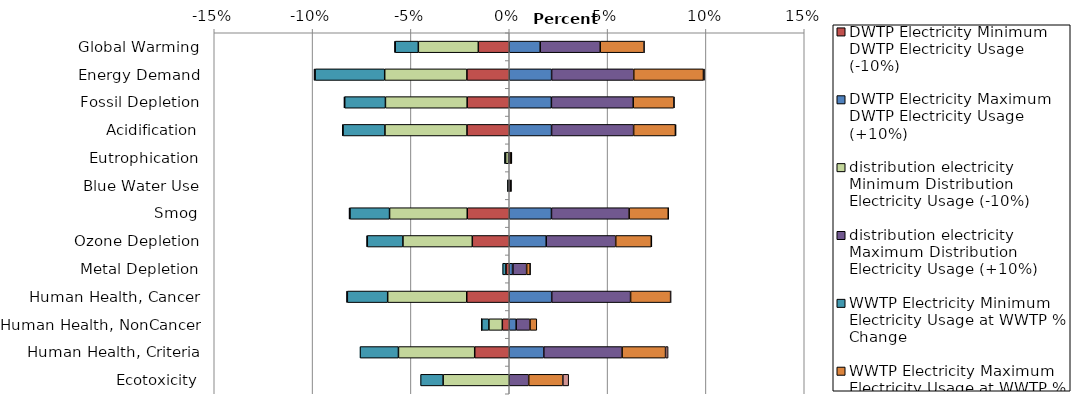
| Category | DWTP Electricity | distribution electricity | WWTP Electricity | collection electricity |
|---|---|---|---|---|
| Global Warming | 0.016 | 0.031 | 0.022 | 0 |
| Energy Demand | 0.022 | 0.042 | 0.035 | 0.001 |
| Fossil Depletion | 0.021 | 0.042 | 0.021 | 0 |
| Acidification | 0.022 | 0.042 | 0.021 | 0 |
| Eutrophication | 0 | 0 | 0 | 0 |
| Blue Water Use | 0 | 0 | 0 | 0 |
| Smog | 0.021 | 0.039 | 0.02 | 0 |
| Ozone Depletion | 0.019 | 0.035 | 0.018 | 0 |
| Metal Depletion | 0.002 | 0.007 | 0.002 | 0 |
| Human Health, Cancer | 0.022 | 0.04 | 0.02 | 0 |
| Human Health, NonCancer | 0.004 | 0.007 | 0.003 | 0 |
| Human Health, Criteria | 0.018 | 0.04 | 0.022 | 0.001 |
| Ecotoxicity | 0 | 0.01 | 0.017 | 0.003 |